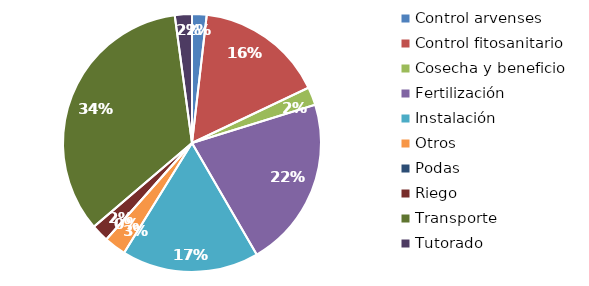
| Category | Valor |
|---|---|
| Control arvenses | 850000 |
| Control fitosanitario | 7510000 |
| Cosecha y beneficio | 1050000 |
| Fertilización | 9980000 |
| Instalación | 8000000 |
| Otros | 1280000 |
| Podas | 0 |
| Riego | 1025000 |
| Transporte | 15880000 |
| Tutorado | 1000000 |